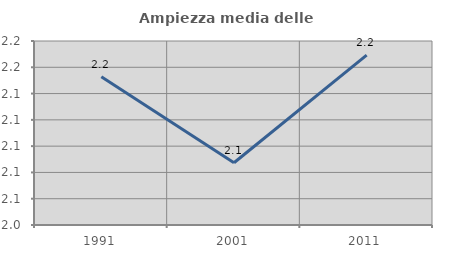
| Category | Ampiezza media delle famiglie |
|---|---|
| 1991.0 | 2.153 |
| 2001.0 | 2.087 |
| 2011.0 | 2.169 |